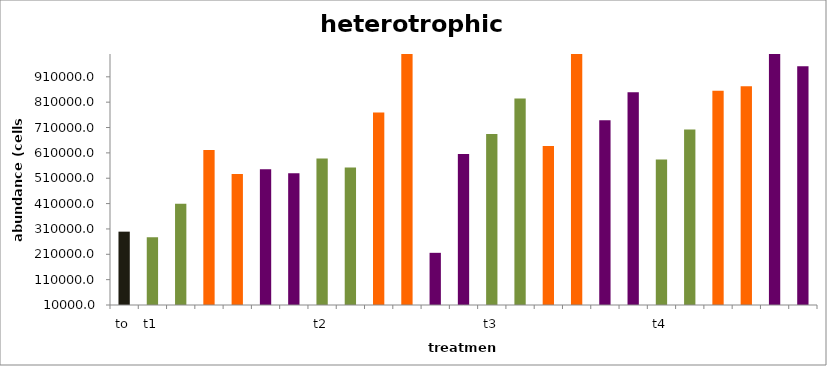
| Category | Series 0 |
|---|---|
| to | 299298.145 |
| t1 | 276761.573 |
|  | 409447.016 |
|  | 621095.686 |
|  | 527103.615 |
|  | 545859.588 |
|  | 529409.746 |
| t2 | 588291.035 |
|  | 552113.049 |
|  | 768873.672 |
|  | 1063342.535 |
|  | 215807.581 |
|  | 605585.472 |
| t3 | 684147.02 |
|  | 824525.65 |
|  | 637138.055 |
|  | 1105077.085 |
|  | 738685.631 |
|  | 849484.056 |
| t4 | 584209.13 |